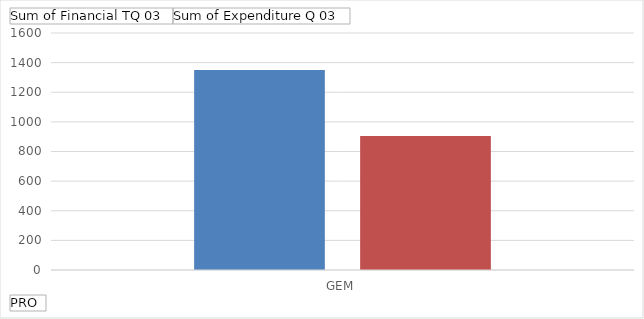
| Category | Sum of Financial TQ 03 | Sum of Expenditure Q 03 |
|---|---|---|
| GEM | 1350 | 905 |